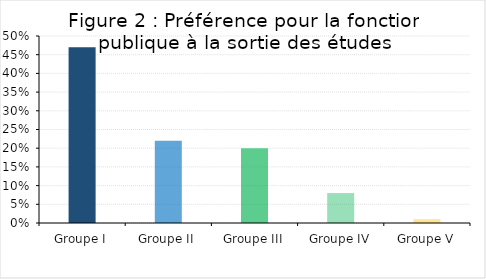
| Category | Series 0 |
|---|---|
| Groupe I | 0.47 |
| Groupe II | 0.22 |
| Groupe III | 0.2 |
| Groupe IV | 0.08 |
| Groupe V | 0.01 |